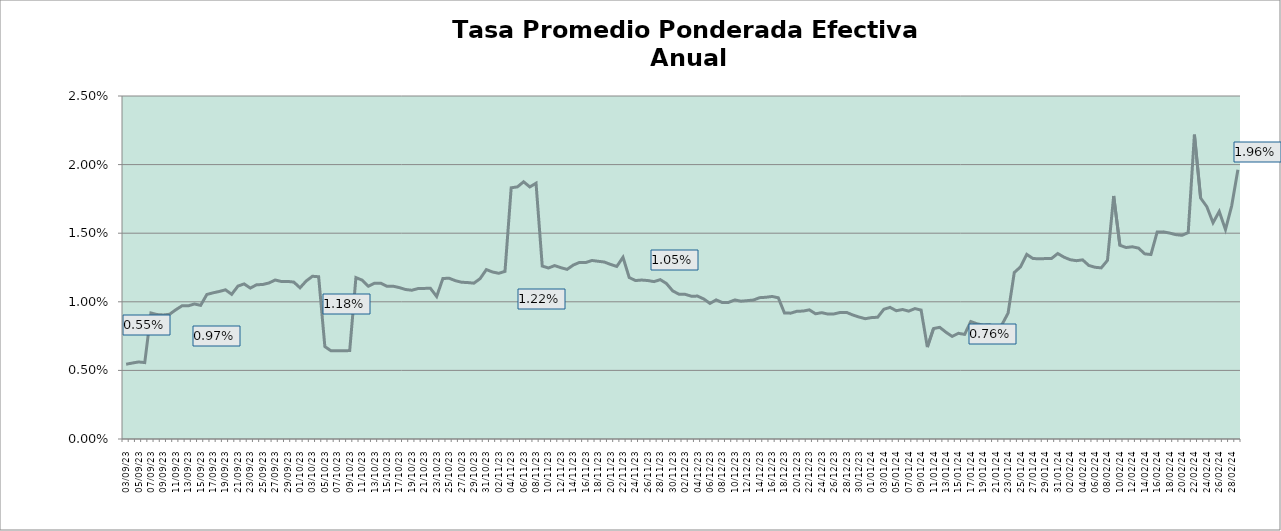
| Category | TEA |
|---|---|
| 2023-09-03 | 0.005 |
| 2023-09-04 | 0.006 |
| 2023-09-05 | 0.006 |
| 2023-09-06 | 0.006 |
| 2023-09-07 | 0.009 |
| 2023-09-08 | 0.009 |
| 2023-09-09 | 0.009 |
| 2023-09-10 | 0.009 |
| 2023-09-11 | 0.009 |
| 2023-09-12 | 0.01 |
| 2023-09-13 | 0.01 |
| 2023-09-14 | 0.01 |
| 2023-09-15 | 0.01 |
| 2023-09-16 | 0.011 |
| 2023-09-17 | 0.011 |
| 2023-09-18 | 0.011 |
| 2023-09-19 | 0.011 |
| 2023-09-20 | 0.011 |
| 2023-09-21 | 0.011 |
| 2023-09-22 | 0.011 |
| 2023-09-23 | 0.011 |
| 2023-09-24 | 0.011 |
| 2023-09-25 | 0.011 |
| 2023-09-26 | 0.011 |
| 2023-09-27 | 0.012 |
| 2023-09-28 | 0.011 |
| 2023-09-29 | 0.011 |
| 2023-09-30 | 0.011 |
| 2023-10-01 | 0.011 |
| 2023-10-02 | 0.012 |
| 2023-10-03 | 0.012 |
| 2023-10-04 | 0.012 |
| 2023-10-05 | 0.007 |
| 2023-10-06 | 0.006 |
| 2023-10-07 | 0.006 |
| 2023-10-08 | 0.006 |
| 2023-10-09 | 0.006 |
| 2023-10-10 | 0.012 |
| 2023-10-11 | 0.012 |
| 2023-10-12 | 0.011 |
| 2023-10-13 | 0.011 |
| 2023-10-14 | 0.011 |
| 2023-10-15 | 0.011 |
| 2023-10-16 | 0.011 |
| 2023-10-17 | 0.011 |
| 2023-10-18 | 0.011 |
| 2023-10-19 | 0.011 |
| 2023-10-20 | 0.011 |
| 2023-10-21 | 0.011 |
| 2023-10-22 | 0.011 |
| 2023-10-23 | 0.01 |
| 2023-10-24 | 0.012 |
| 2023-10-25 | 0.012 |
| 2023-10-26 | 0.012 |
| 2023-10-27 | 0.011 |
| 2023-10-28 | 0.011 |
| 2023-10-29 | 0.011 |
| 2023-10-30 | 0.012 |
| 2023-10-31 | 0.012 |
| 2023-11-01 | 0.012 |
| 2023-11-02 | 0.012 |
| 2023-11-03 | 0.012 |
| 2023-11-04 | 0.018 |
| 2023-11-05 | 0.018 |
| 2023-11-06 | 0.019 |
| 2023-11-07 | 0.018 |
| 2023-11-08 | 0.019 |
| 2023-11-09 | 0.013 |
| 2023-11-10 | 0.012 |
| 2023-11-11 | 0.013 |
| 2023-11-12 | 0.012 |
| 2023-11-13 | 0.012 |
| 2023-11-14 | 0.013 |
| 2023-11-15 | 0.013 |
| 2023-11-16 | 0.013 |
| 2023-11-17 | 0.013 |
| 2023-11-18 | 0.013 |
| 2023-11-19 | 0.013 |
| 2023-11-20 | 0.013 |
| 2023-11-21 | 0.013 |
| 2023-11-22 | 0.013 |
| 2023-11-23 | 0.012 |
| 2023-11-24 | 0.012 |
| 2023-11-25 | 0.012 |
| 2023-11-26 | 0.012 |
| 2023-11-27 | 0.011 |
| 2023-11-28 | 0.012 |
| 2023-11-29 | 0.011 |
| 2023-11-30 | 0.011 |
| 2023-12-01 | 0.011 |
| 2023-12-02 | 0.011 |
| 2023-12-03 | 0.01 |
| 2023-12-04 | 0.01 |
| 2023-12-05 | 0.01 |
| 2023-12-06 | 0.01 |
| 2023-12-07 | 0.01 |
| 2023-12-08 | 0.01 |
| 2023-12-09 | 0.01 |
| 2023-12-10 | 0.01 |
| 2023-12-11 | 0.01 |
| 2023-12-12 | 0.01 |
| 2023-12-13 | 0.01 |
| 2023-12-14 | 0.01 |
| 2023-12-15 | 0.01 |
| 2023-12-16 | 0.01 |
| 2023-12-17 | 0.01 |
| 2023-12-18 | 0.009 |
| 2023-12-19 | 0.009 |
| 2023-12-20 | 0.009 |
| 2023-12-21 | 0.009 |
| 2023-12-22 | 0.009 |
| 2023-12-23 | 0.009 |
| 2023-12-24 | 0.009 |
| 2023-12-25 | 0.009 |
| 2023-12-26 | 0.009 |
| 2023-12-27 | 0.009 |
| 2023-12-28 | 0.009 |
| 2023-12-29 | 0.009 |
| 2023-12-30 | 0.009 |
| 2023-12-31 | 0.009 |
| 2024-01-01 | 0.009 |
| 2024-01-02 | 0.009 |
| 2024-01-03 | 0.009 |
| 2024-01-04 | 0.01 |
| 2024-01-05 | 0.009 |
| 2024-01-06 | 0.009 |
| 2024-01-07 | 0.009 |
| 2024-01-08 | 0.01 |
| 2024-01-09 | 0.009 |
| 2024-01-10 | 0.007 |
| 2024-01-11 | 0.008 |
| 2024-01-12 | 0.008 |
| 2024-01-13 | 0.008 |
| 2024-01-14 | 0.007 |
| 2024-01-15 | 0.008 |
| 2024-01-16 | 0.008 |
| 2024-01-17 | 0.009 |
| 2024-01-18 | 0.008 |
| 2024-01-19 | 0.008 |
| 2024-01-20 | 0.008 |
| 2024-01-21 | 0.008 |
| 2024-01-22 | 0.008 |
| 2024-01-23 | 0.009 |
| 2024-01-24 | 0.012 |
| 2024-01-25 | 0.013 |
| 2024-01-26 | 0.013 |
| 2024-01-27 | 0.013 |
| 2024-01-28 | 0.013 |
| 2024-01-29 | 0.013 |
| 2024-01-30 | 0.013 |
| 2024-01-31 | 0.014 |
| 2024-02-01 | 0.013 |
| 2024-02-02 | 0.013 |
| 2024-02-03 | 0.013 |
| 2024-02-04 | 0.013 |
| 2024-02-05 | 0.013 |
| 2024-02-06 | 0.013 |
| 2024-02-07 | 0.012 |
| 2024-02-08 | 0.013 |
| 2024-02-09 | 0.018 |
| 2024-02-10 | 0.014 |
| 2024-02-11 | 0.014 |
| 2024-02-12 | 0.014 |
| 2024-02-13 | 0.014 |
| 2024-02-14 | 0.013 |
| 2024-02-15 | 0.013 |
| 2024-02-16 | 0.015 |
| 2024-02-17 | 0.015 |
| 2024-02-18 | 0.015 |
| 2024-02-19 | 0.015 |
| 2024-02-20 | 0.015 |
| 2024-02-21 | 0.015 |
| 2024-02-22 | 0.022 |
| 2024-02-23 | 0.018 |
| 2024-02-24 | 0.017 |
| 2024-02-25 | 0.016 |
| 2024-02-26 | 0.017 |
| 2024-02-27 | 0.015 |
| 2024-02-28 | 0.017 |
| 2024-02-29 | 0.02 |